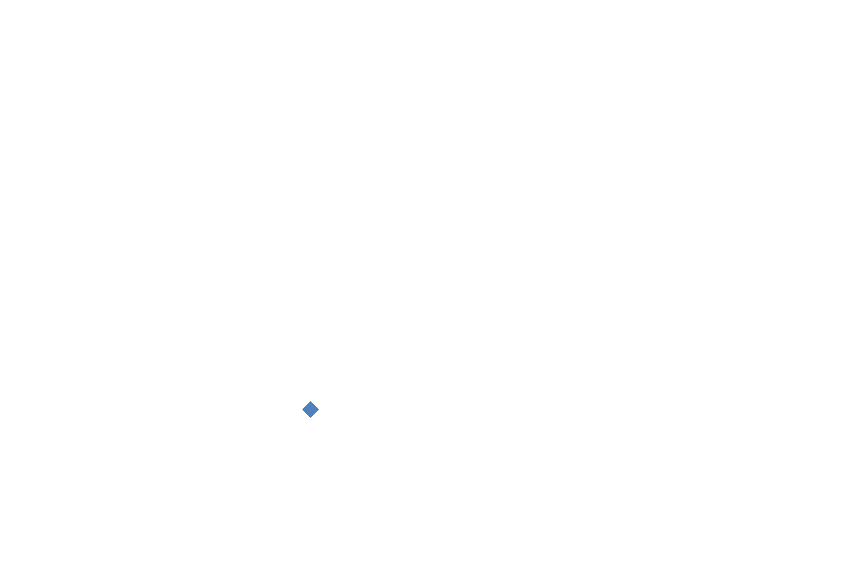
| Category | 1000  |
|---|---|
| 1500.0 | 1000 |
| 1500.0 | 1000 |
| 1500.0 | 1000 |
| 1500.0 | 1000 |
| 1500.0 | 1000 |
| 1500.0 | 1000 |
| 1500.0 | 1000 |